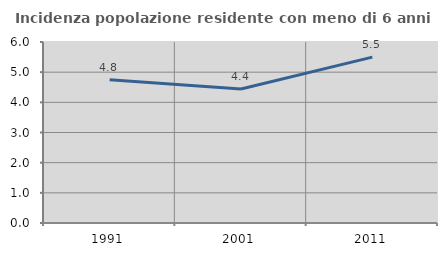
| Category | Incidenza popolazione residente con meno di 6 anni |
|---|---|
| 1991.0 | 4.752 |
| 2001.0 | 4.441 |
| 2011.0 | 5.499 |